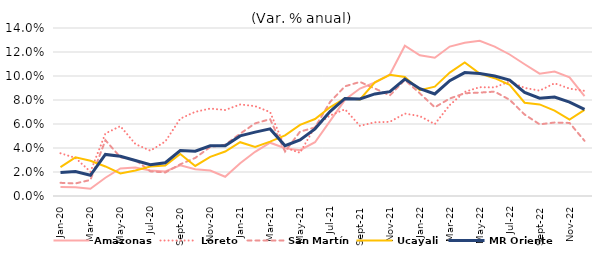
| Category | Amazonas | Loreto | San Martín | Ucayali | MR Oriente |
|---|---|---|---|---|---|
| 2020-01-01 | 0.008 | 0.036 | 0.011 | 0.024 | 0.02 |
| 2020-02-01 | 0.007 | 0.032 | 0.01 | 0.032 | 0.02 |
| 2020-03-01 | 0.006 | 0.02 | 0.013 | 0.029 | 0.017 |
| 2020-04-01 | 0.015 | 0.052 | 0.046 | 0.025 | 0.035 |
| 2020-05-01 | 0.023 | 0.058 | 0.032 | 0.019 | 0.033 |
| 2020-06-01 | 0.024 | 0.043 | 0.03 | 0.021 | 0.03 |
| 2020-07-01 | 0.021 | 0.038 | 0.021 | 0.025 | 0.026 |
| 2020-08-01 | 0.02 | 0.045 | 0.02 | 0.025 | 0.028 |
| 2020-09-01 | 0.026 | 0.064 | 0.026 | 0.035 | 0.038 |
| 2020-10-01 | 0.022 | 0.07 | 0.032 | 0.025 | 0.037 |
| 2020-11-01 | 0.021 | 0.073 | 0.041 | 0.033 | 0.042 |
| 2020-12-01 | 0.016 | 0.072 | 0.043 | 0.037 | 0.042 |
| 2021-01-01 | 0.027 | 0.076 | 0.052 | 0.045 | 0.05 |
| 2021-02-01 | 0.037 | 0.075 | 0.061 | 0.041 | 0.053 |
| 2021-03-01 | 0.044 | 0.07 | 0.064 | 0.045 | 0.056 |
| 2021-04-01 | 0.04 | 0.04 | 0.037 | 0.051 | 0.042 |
| 2021-05-01 | 0.038 | 0.036 | 0.054 | 0.059 | 0.047 |
| 2021-06-01 | 0.045 | 0.058 | 0.057 | 0.064 | 0.056 |
| 2021-07-01 | 0.062 | 0.067 | 0.078 | 0.074 | 0.07 |
| 2021-08-01 | 0.08 | 0.072 | 0.091 | 0.082 | 0.081 |
| 2021-09-01 | 0.09 | 0.058 | 0.095 | 0.08 | 0.081 |
| 2021-10-01 | 0.095 | 0.061 | 0.09 | 0.095 | 0.085 |
| 2021-11-01 | 0.101 | 0.062 | 0.084 | 0.101 | 0.087 |
| 2021-12-01 | 0.125 | 0.069 | 0.097 | 0.099 | 0.097 |
| 2022-01-01 | 0.117 | 0.067 | 0.086 | 0.088 | 0.089 |
| 2022-02-01 | 0.115 | 0.06 | 0.074 | 0.091 | 0.085 |
| 2022-03-01 | 0.125 | 0.076 | 0.081 | 0.103 | 0.096 |
| 2022-04-01 | 0.128 | 0.087 | 0.086 | 0.111 | 0.103 |
| 2022-05-01 | 0.129 | 0.091 | 0.086 | 0.102 | 0.102 |
| 2022-06-01 | 0.124 | 0.09 | 0.087 | 0.098 | 0.1 |
| 2022-07-01 | 0.118 | 0.095 | 0.08 | 0.093 | 0.097 |
| 2022-08-01 | 0.11 | 0.09 | 0.068 | 0.078 | 0.086 |
| 2022-09-01 | 0.102 | 0.088 | 0.06 | 0.076 | 0.081 |
| 2022-10-01 | 0.104 | 0.094 | 0.061 | 0.071 | 0.082 |
| 2022-11-01 | 0.099 | 0.089 | 0.061 | 0.064 | 0.078 |
| 2022-12-01 | 0.083 | 0.088 | 0.046 | 0.072 | 0.072 |